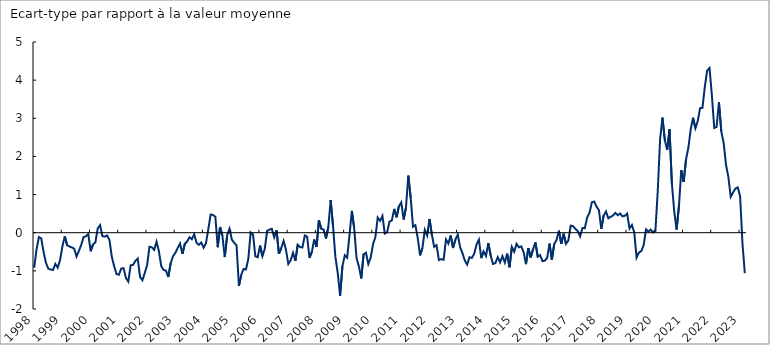
| Category | gscpi |
|---|---|
| 1998-01-31 | -0.916 |
| 1998-02-28 | -0.445 |
| 1998-03-31 | -0.114 |
| 1998-04-30 | -0.15 |
| 1998-05-31 | -0.505 |
| 1998-06-30 | -0.789 |
| 1998-07-31 | -0.942 |
| 1998-08-31 | -0.963 |
| 1998-09-30 | -0.978 |
| 1998-10-31 | -0.817 |
| 1998-11-30 | -0.917 |
| 1998-12-31 | -0.717 |
| 1999-01-31 | -0.354 |
| 1999-02-28 | -0.096 |
| 1999-03-31 | -0.329 |
| 1999-04-30 | -0.361 |
| 1999-05-31 | -0.384 |
| 1999-06-30 | -0.418 |
| 1999-07-31 | -0.623 |
| 1999-08-31 | -0.479 |
| 1999-09-30 | -0.319 |
| 1999-10-31 | -0.113 |
| 1999-11-30 | -0.093 |
| 1999-12-31 | -0.037 |
| 2000-01-31 | -0.487 |
| 2000-02-29 | -0.306 |
| 2000-03-31 | -0.255 |
| 2000-04-30 | 0.11 |
| 2000-05-31 | 0.199 |
| 2000-06-30 | -0.091 |
| 2000-07-31 | -0.101 |
| 2000-08-31 | -0.07 |
| 2000-09-30 | -0.192 |
| 2000-10-31 | -0.636 |
| 2000-11-30 | -0.882 |
| 2000-12-31 | -1.084 |
| 2001-01-31 | -1.103 |
| 2001-02-28 | -0.938 |
| 2001-03-31 | -0.933 |
| 2001-04-30 | -1.186 |
| 2001-05-31 | -1.28 |
| 2001-06-30 | -0.854 |
| 2001-07-31 | -0.845 |
| 2001-08-31 | -0.74 |
| 2001-09-30 | -0.675 |
| 2001-10-31 | -1.162 |
| 2001-11-30 | -1.245 |
| 2001-12-31 | -1.055 |
| 2002-01-31 | -0.848 |
| 2002-02-28 | -0.367 |
| 2002-03-31 | -0.383 |
| 2002-04-30 | -0.449 |
| 2002-05-31 | -0.237 |
| 2002-06-30 | -0.486 |
| 2002-07-31 | -0.875 |
| 2002-08-31 | -0.977 |
| 2002-09-30 | -0.994 |
| 2002-10-31 | -1.162 |
| 2002-11-30 | -0.798 |
| 2002-12-31 | -0.618 |
| 2003-01-31 | -0.527 |
| 2003-02-28 | -0.399 |
| 2003-03-31 | -0.284 |
| 2003-04-30 | -0.556 |
| 2003-05-31 | -0.293 |
| 2003-06-30 | -0.229 |
| 2003-07-31 | -0.119 |
| 2003-08-31 | -0.171 |
| 2003-09-30 | -0.042 |
| 2003-10-31 | -0.264 |
| 2003-11-30 | -0.316 |
| 2003-12-31 | -0.255 |
| 2004-01-31 | -0.393 |
| 2004-02-29 | -0.276 |
| 2004-03-31 | 0.094 |
| 2004-04-30 | 0.477 |
| 2004-05-31 | 0.466 |
| 2004-06-30 | 0.415 |
| 2004-07-31 | -0.379 |
| 2004-08-31 | 0.15 |
| 2004-09-30 | -0.084 |
| 2004-10-31 | -0.638 |
| 2004-11-30 | -0.07 |
| 2004-12-31 | 0.105 |
| 2005-01-31 | -0.181 |
| 2005-02-28 | -0.264 |
| 2005-03-31 | -0.332 |
| 2005-04-30 | -1.394 |
| 2005-05-31 | -1.105 |
| 2005-06-30 | -0.949 |
| 2005-07-31 | -0.964 |
| 2005-08-31 | -0.687 |
| 2005-09-30 | 0.007 |
| 2005-10-31 | -0.051 |
| 2005-11-30 | -0.62 |
| 2005-12-31 | -0.642 |
| 2006-01-31 | -0.337 |
| 2006-02-28 | -0.614 |
| 2006-03-31 | -0.423 |
| 2006-04-30 | 0.049 |
| 2006-05-31 | 0.082 |
| 2006-06-30 | 0.102 |
| 2006-07-31 | -0.12 |
| 2006-08-31 | 0.068 |
| 2006-09-30 | -0.553 |
| 2006-10-31 | -0.401 |
| 2006-11-30 | -0.213 |
| 2006-12-31 | -0.446 |
| 2007-01-31 | -0.82 |
| 2007-02-28 | -0.721 |
| 2007-03-31 | -0.526 |
| 2007-04-30 | -0.739 |
| 2007-05-31 | -0.315 |
| 2007-06-30 | -0.376 |
| 2007-07-31 | -0.387 |
| 2007-08-31 | -0.075 |
| 2007-09-30 | -0.105 |
| 2007-10-31 | -0.657 |
| 2007-11-30 | -0.505 |
| 2007-12-31 | -0.178 |
| 2008-01-31 | -0.373 |
| 2008-02-29 | 0.326 |
| 2008-03-31 | 0.104 |
| 2008-04-30 | 0.082 |
| 2008-05-31 | -0.152 |
| 2008-06-30 | 0.15 |
| 2008-07-31 | 0.857 |
| 2008-08-31 | 0.171 |
| 2008-09-30 | -0.635 |
| 2008-10-31 | -1.05 |
| 2008-11-30 | -1.652 |
| 2008-12-31 | -0.874 |
| 2009-01-31 | -0.592 |
| 2009-02-28 | -0.655 |
| 2009-03-31 | -0.063 |
| 2009-04-30 | 0.574 |
| 2009-05-31 | 0.118 |
| 2009-06-30 | -0.67 |
| 2009-07-31 | -0.882 |
| 2009-08-31 | -1.199 |
| 2009-09-30 | -0.565 |
| 2009-10-31 | -0.525 |
| 2009-11-30 | -0.82 |
| 2009-12-31 | -0.655 |
| 2010-01-31 | -0.303 |
| 2010-02-28 | -0.113 |
| 2010-03-31 | 0.397 |
| 2010-04-30 | 0.312 |
| 2010-05-31 | 0.439 |
| 2010-06-30 | -0.022 |
| 2010-07-31 | 0.015 |
| 2010-08-31 | 0.291 |
| 2010-09-30 | 0.32 |
| 2010-10-31 | 0.624 |
| 2010-11-30 | 0.404 |
| 2010-12-31 | 0.694 |
| 2011-01-31 | 0.794 |
| 2011-02-28 | 0.347 |
| 2011-03-31 | 0.66 |
| 2011-04-30 | 1.497 |
| 2011-05-31 | 0.915 |
| 2011-06-30 | 0.159 |
| 2011-07-31 | 0.197 |
| 2011-08-31 | -0.14 |
| 2011-09-30 | -0.593 |
| 2011-10-31 | -0.4 |
| 2011-11-30 | 0.074 |
| 2011-12-31 | -0.073 |
| 2012-01-31 | 0.36 |
| 2012-02-29 | -0.052 |
| 2012-03-31 | -0.372 |
| 2012-04-30 | -0.326 |
| 2012-05-31 | -0.718 |
| 2012-06-30 | -0.691 |
| 2012-07-31 | -0.71 |
| 2012-08-31 | -0.177 |
| 2012-09-30 | -0.283 |
| 2012-10-31 | -0.072 |
| 2012-11-30 | -0.401 |
| 2012-12-31 | -0.183 |
| 2013-01-31 | -0.051 |
| 2013-02-28 | -0.377 |
| 2013-03-31 | -0.536 |
| 2013-04-30 | -0.727 |
| 2013-05-31 | -0.835 |
| 2013-06-30 | -0.643 |
| 2013-07-31 | -0.662 |
| 2013-08-31 | -0.549 |
| 2013-09-30 | -0.305 |
| 2013-10-31 | -0.183 |
| 2013-11-30 | -0.666 |
| 2013-12-31 | -0.489 |
| 2014-01-31 | -0.609 |
| 2014-02-28 | -0.271 |
| 2014-03-31 | -0.603 |
| 2014-04-30 | -0.819 |
| 2014-05-31 | -0.796 |
| 2014-06-30 | -0.639 |
| 2014-07-31 | -0.778 |
| 2014-08-31 | -0.615 |
| 2014-09-30 | -0.781 |
| 2014-10-31 | -0.549 |
| 2014-11-30 | -0.906 |
| 2014-12-31 | -0.373 |
| 2015-01-31 | -0.496 |
| 2015-02-28 | -0.293 |
| 2015-03-31 | -0.384 |
| 2015-04-30 | -0.358 |
| 2015-05-31 | -0.511 |
| 2015-06-30 | -0.824 |
| 2015-07-31 | -0.401 |
| 2015-08-31 | -0.651 |
| 2015-09-30 | -0.428 |
| 2015-10-31 | -0.253 |
| 2015-11-30 | -0.631 |
| 2015-12-31 | -0.588 |
| 2016-01-31 | -0.745 |
| 2016-02-29 | -0.734 |
| 2016-03-31 | -0.66 |
| 2016-04-30 | -0.286 |
| 2016-05-31 | -0.708 |
| 2016-06-30 | -0.296 |
| 2016-07-31 | -0.189 |
| 2016-08-31 | 0.054 |
| 2016-09-30 | -0.293 |
| 2016-10-31 | -0.027 |
| 2016-11-30 | -0.292 |
| 2016-12-31 | -0.205 |
| 2017-01-31 | 0.186 |
| 2017-02-28 | 0.174 |
| 2017-03-31 | 0.099 |
| 2017-04-30 | 0.043 |
| 2017-05-31 | -0.097 |
| 2017-06-30 | 0.124 |
| 2017-07-31 | 0.119 |
| 2017-08-31 | 0.401 |
| 2017-09-30 | 0.526 |
| 2017-10-31 | 0.799 |
| 2017-11-30 | 0.817 |
| 2017-12-31 | 0.683 |
| 2018-01-31 | 0.589 |
| 2018-02-28 | 0.1 |
| 2018-03-31 | 0.447 |
| 2018-04-30 | 0.556 |
| 2018-05-31 | 0.377 |
| 2018-06-30 | 0.418 |
| 2018-07-31 | 0.451 |
| 2018-08-31 | 0.52 |
| 2018-09-30 | 0.457 |
| 2018-10-31 | 0.504 |
| 2018-11-30 | 0.43 |
| 2018-12-31 | 0.443 |
| 2019-01-31 | 0.502 |
| 2019-02-28 | 0.109 |
| 2019-03-31 | 0.203 |
| 2019-04-30 | 0.015 |
| 2019-05-31 | -0.653 |
| 2019-06-30 | -0.521 |
| 2019-07-31 | -0.483 |
| 2019-08-31 | -0.33 |
| 2019-09-30 | 0.087 |
| 2019-10-31 | 0.028 |
| 2019-11-30 | 0.081 |
| 2019-12-31 | 0.004 |
| 2020-01-31 | 0.045 |
| 2020-02-29 | 1.098 |
| 2020-03-31 | 2.459 |
| 2020-04-30 | 3.018 |
| 2020-05-31 | 2.43 |
| 2020-06-30 | 2.169 |
| 2020-07-31 | 2.711 |
| 2020-08-31 | 1.289 |
| 2020-09-30 | 0.559 |
| 2020-10-31 | 0.084 |
| 2020-11-30 | 0.698 |
| 2020-12-31 | 1.641 |
| 2021-01-31 | 1.331 |
| 2021-02-28 | 1.914 |
| 2021-03-31 | 2.226 |
| 2021-04-30 | 2.71 |
| 2021-05-31 | 3.013 |
| 2021-06-30 | 2.74 |
| 2021-07-31 | 2.93 |
| 2021-08-31 | 3.266 |
| 2021-09-30 | 3.275 |
| 2021-10-31 | 3.827 |
| 2021-11-30 | 4.25 |
| 2021-12-31 | 4.317 |
| 2022-01-31 | 3.602 |
| 2022-02-28 | 2.746 |
| 2022-03-31 | 2.772 |
| 2022-04-30 | 3.42 |
| 2022-05-31 | 2.658 |
| 2022-06-30 | 2.357 |
| 2022-07-31 | 1.782 |
| 2022-08-31 | 1.463 |
| 2022-09-30 | 0.941 |
| 2022-10-31 | 1.053 |
| 2022-11-30 | 1.157 |
| 2022-12-31 | 1.186 |
| 2023-01-31 | 0.958 |
| 2023-02-28 | -0.284 |
| 2023-03-31 | -1.061 |